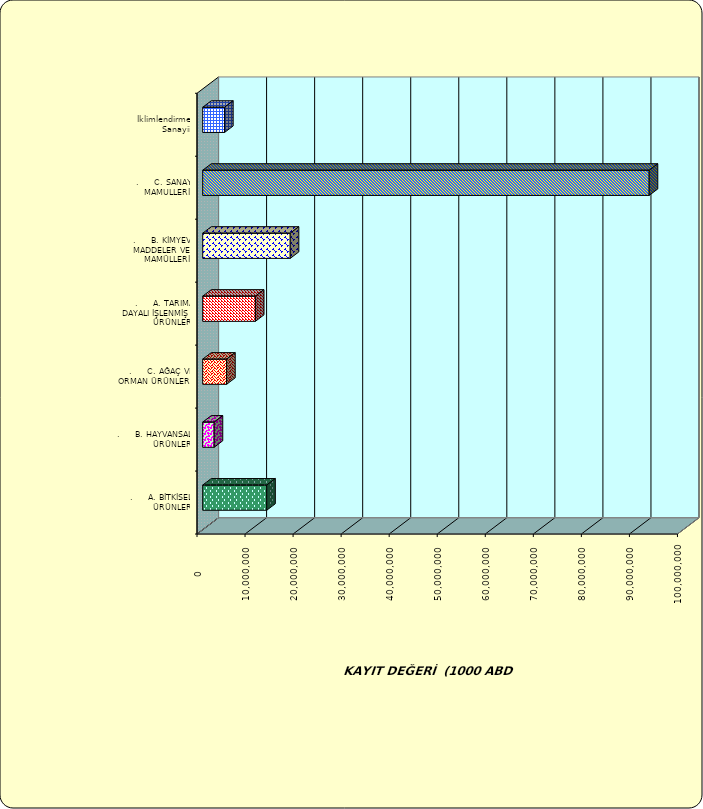
| Category | Series 0 |
|---|---|
| .     A. BİTKİSEL ÜRÜNLER | 13325956.537 |
| .     B. HAYVANSAL ÜRÜNLER | 2382799.391 |
| .     C. AĞAÇ VE ORMAN ÜRÜNLERİ | 4978457.108 |
| .     A. TARIMA DAYALI İŞLENMİŞ ÜRÜNLER | 10969987.255 |
| .     B. KİMYEVİ MADDELER VE MAMÜLLERİ | 18218193.037 |
| .     C. SANAYİ MAMULLERİ | 92927193.977 |
|  İklimlendirme Sanayii | 4551940.978 |